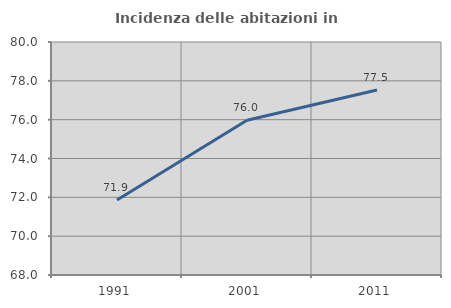
| Category | Incidenza delle abitazioni in proprietà  |
|---|---|
| 1991.0 | 71.861 |
| 2001.0 | 75.969 |
| 2011.0 | 77.528 |